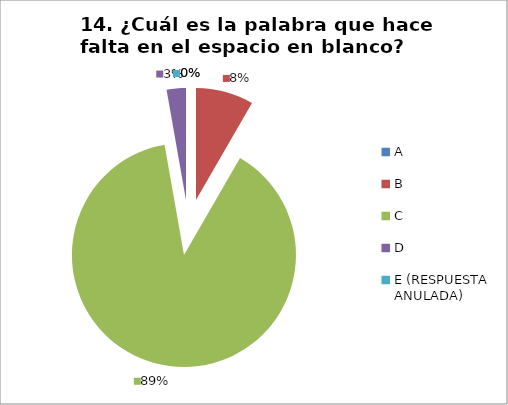
| Category | CANTIDAD DE RESPUESTAS PREGUNTA (14) | PORCENTAJE |
|---|---|---|
| A | 0 | 0 |
| B | 3 | 0.083 |
| C | 32 | 0.889 |
| D | 1 | 0.028 |
| E (RESPUESTA ANULADA) | 0 | 0 |